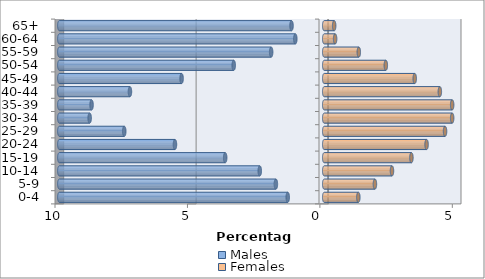
| Category | Males | Females |
|---|---|---|
| 0-4 | -1.377 | 1.288 |
| 5-9 | -1.825 | 1.914 |
| 10-14 | -2.433 | 2.558 |
| 15-19 | -3.739 | 3.292 |
| 20-24 | -5.635 | 3.864 |
| 25-29 | -7.549 | 4.562 |
| 30-34 | -8.855 | 4.83 |
| 35-39 | -8.784 | 4.83 |
| 40-44 | -7.335 | 4.365 |
| 45-49 | -5.385 | 3.417 |
| 50-54 | -3.417 | 2.326 |
| 55-59 | -2.004 | 1.306 |
| 60-64 | -1.091 | 0.411 |
| 65+ | -1.234 | 0.376 |